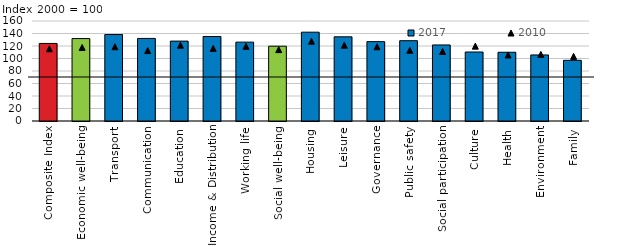
| Category | 2017 |
|---|---|
| Composite Index | 124.1 |
| Economic well-being | 131.9 |
| Transport | 138.4 |
| Communication | 132.1 |
| Education | 127.8 |
| Income & Distribution | 135.2 |
| Working life | 126.2 |
| Social well-being | 119.7 |
| Housing | 142.1 |
| Leisure | 134.7 |
| Governance | 127 |
| Public safety | 128.5 |
| Social participation | 121.7 |
| Culture | 110.4 |
| Health | 110 |
| Environment | 105.7 |
| Family | 97.1 |